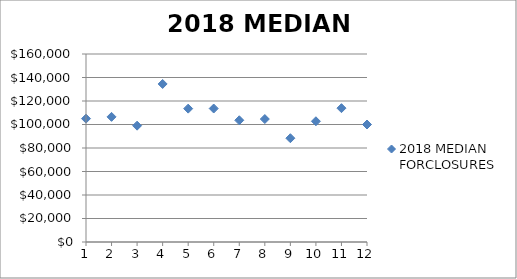
| Category | 2018 MEDIAN FORCLOSURES |
|---|---|
| 1.0 | 105000 |
| 2.0 | 106500 |
| 3.0 | 99003 |
| 4.0 | 134500 |
| 5.0 | 113500 |
| 6.0 | 113600 |
| 7.0 | 103600 |
| 8.0 | 104641 |
| 9.0 | 88330 |
| 10.0 | 102750 |
| 11.0 | 113900 |
| 12.0 | 100000 |